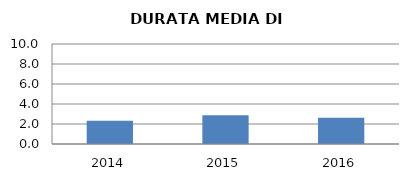
| Category | 2014 2015 2016 |
|---|---|
| 2014.0 | 2.333 |
| 2015.0 | 2.875 |
| 2016.0 | 2.636 |